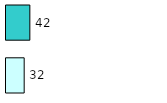
| Category | Series 0 | Series 1 |
|---|---|---|
| 0 | 32 | 42 |